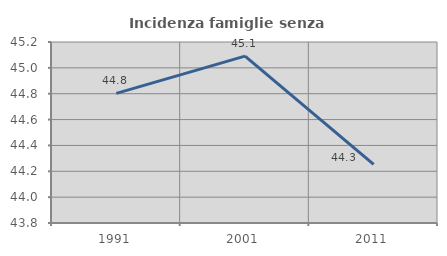
| Category | Incidenza famiglie senza nuclei |
|---|---|
| 1991.0 | 44.803 |
| 2001.0 | 45.091 |
| 2011.0 | 44.253 |